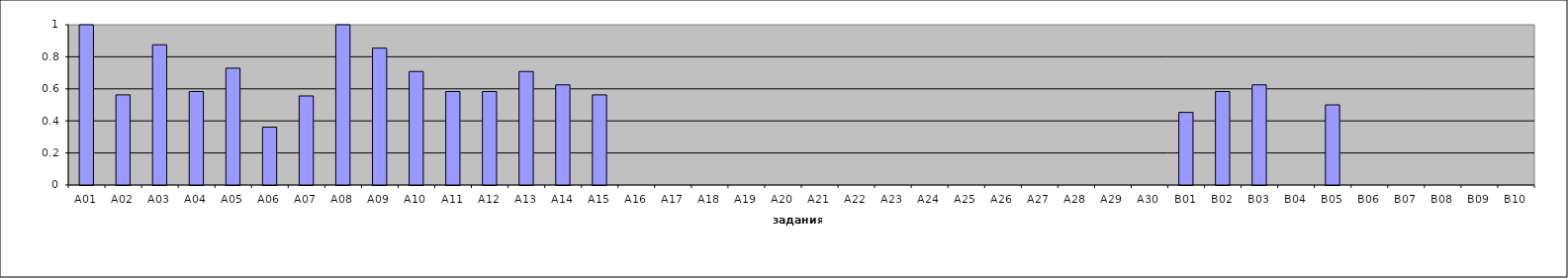
| Category | Общие результаты по тесту |
|---|---|
| A01 | 1 |
| A02 | 0.562 |
| A03 | 0.875 |
| A04 | 0.583 |
| A05 | 0.729 |
| A06 | 0.361 |
| A07 | 0.556 |
| A08 | 1 |
| A09 | 0.854 |
| A10 | 0.708 |
| A11 | 0.583 |
| A12 | 0.583 |
| A13 | 0.708 |
| A14 | 0.625 |
| A15 | 0.562 |
| A16 | 0 |
| A17 | 0 |
| A18 | 0 |
| A19 | 0 |
| A20 | 0 |
| A21 | 0 |
| A22 | 0 |
| A23 | 0 |
| A24 | 0 |
| A25 | 0 |
| A26 | 0 |
| A27 | 0 |
| A28 | 0 |
| A29 | 0 |
| A30 | 0 |
| B01 | 0.453 |
| B02 | 0.583 |
| B03 | 0.625 |
| B04 | 0 |
| B05 | 0.5 |
| B06 | 0 |
| B07 | 0 |
| B08 | 0 |
| B09 | 0 |
| B10 | 0 |